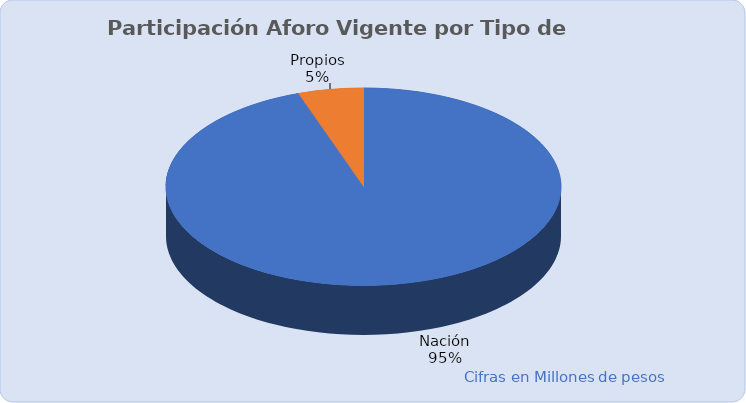
| Category | Total |
|---|---|
| Nación | 5024124.292 |
| Propios | 284167 |